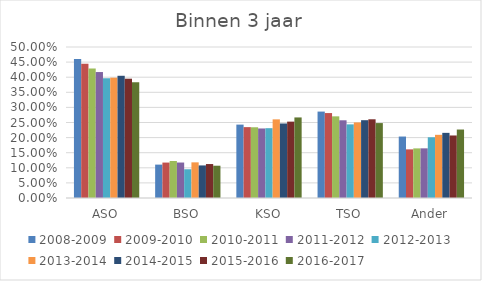
| Category | 2008-2009 | 2009-2010 | 2010-2011 | 2011-2012 | 2012-2013 | 2013-2014 | 2014-2015 | 2015-2016 | 2016-2017 |
|---|---|---|---|---|---|---|---|---|---|
| ASO | 0.46 | 0.445 | 0.429 | 0.417 | 0.397 | 0.398 | 0.405 | 0.395 | 0.383 |
| BSO | 0.111 | 0.117 | 0.122 | 0.117 | 0.095 | 0.118 | 0.108 | 0.112 | 0.107 |
| KSO | 0.243 | 0.235 | 0.234 | 0.23 | 0.231 | 0.26 | 0.247 | 0.253 | 0.267 |
| TSO | 0.286 | 0.281 | 0.27 | 0.257 | 0.244 | 0.25 | 0.258 | 0.261 | 0.248 |
| Ander | 0.204 | 0.161 | 0.164 | 0.164 | 0.201 | 0.209 | 0.216 | 0.207 | 0.227 |